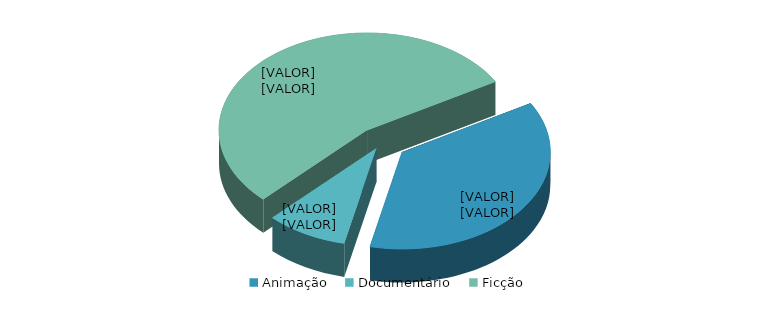
| Category | Series 0 | Series 1 |
|---|---|---|
| Animação | 141 | 0.368 |
| Documentário | 34 | 0.089 |
| Ficção | 208 | 0.543 |